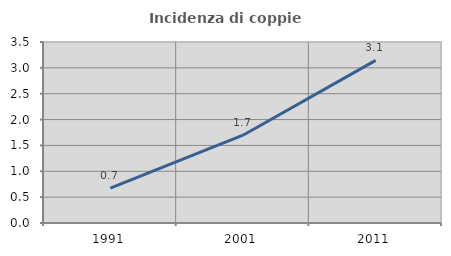
| Category | Incidenza di coppie miste |
|---|---|
| 1991.0 | 0.674 |
| 2001.0 | 1.698 |
| 2011.0 | 3.144 |